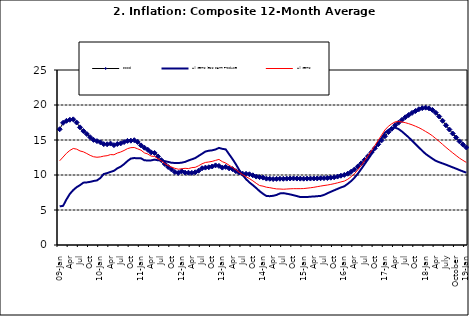
| Category | Food | All Items less Farm Produce | All Items |
|---|---|---|---|
| 09-Jan | 16.536 | 5.519 | 12.032 |
| Feb | 17.454 | 5.591 | 12.567 |
| Mar | 17.742 | 6.51 | 13.101 |
| Apr | 17.89 | 7.302 | 13.51 |
| May | 17.949 | 7.847 | 13.787 |
| June | 17.498 | 8.259 | 13.694 |
| Jul | 16.808 | 8.554 | 13.437 |
| Aug | 16.278 | 8.906 | 13.307 |
| Sep | 15.859 | 8.942 | 13.065 |
| Oct | 15.396 | 9.024 | 12.803 |
| Nov | 15.018 | 9.143 | 12.609 |
| Dec | 14.841 | 9.226 | 12.538 |
| 10-Jan | 14.668 | 9.567 | 12.586 |
| Feb | 14.411 | 10.138 | 12.7 |
| Mar | 14.395 | 10.269 | 12.757 |
| Apr | 14.489 | 10.444 | 12.915 |
| May | 14.266 | 10.597 | 12.893 |
| Jun | 14.424 | 10.948 | 13.132 |
| Jul | 14.514 | 11.193 | 13.284 |
| Aug | 14.706 | 11.549 | 13.5 |
| Sep | 14.872 | 11.997 | 13.764 |
| Oct | 14.906 | 12.345 | 13.908 |
| Nov | 14.967 | 12.423 | 13.928 |
| Dec | 14.723 | 12.383 | 13.74 |
| 11-Jan | 14.233 | 12.385 | 13.542 |
| Feb | 13.903 | 12.099 | 13.161 |
| Mar | 13.606 | 12.077 | 13.001 |
| Apr | 13.227 | 12.088 | 12.694 |
| May | 13.152 | 12.198 | 12.648 |
| Jun | 12.654 | 12.1 | 12.321 |
| Jul | 12.118 | 12.109 | 12.009 |
| Aug | 11.575 | 11.98 | 11.635 |
| Sep | 11.155 | 11.877 | 11.363 |
| Oct | 10.797 | 11.746 | 11.13 |
| Nov | 10.422 | 11.721 | 10.952 |
| Dec | 10.298 | 11.706 | 10.826 |
| 12-Jan | 10.538 | 11.765 | 10.886 |
| 12-Feb | 10.336 | 11.872 | 10.955 |
| 12-Mar | 10.325 | 12.075 | 10.914 |
| Apr | 10.304 | 12.242 | 11.054 |
| May | 10.387 | 12.419 | 11.096 |
| Jun | 10.617 | 12.732 | 11.32 |
| Jul | 10.963 | 13.032 | 11.599 |
| Aug | 11.056 | 13.349 | 11.791 |
| Sep | 11.104 | 13.467 | 11.859 |
| Oct | 11.216 | 13.525 | 11.948 |
| Nov | 11.372 | 13.649 | 12.091 |
| Dec | 11.296 | 13.873 | 12.224 |
| 13-Jan | 11.055 | 13.737 | 11.908 |
| Feb | 11.153 | 13.657 | 11.703 |
| Mar | 10.951 | 12.963 | 11.394 |
| Apr | 10.844 | 12.281 | 11.072 |
| May | 10.548 | 11.531 | 10.761 |
| Jun | 10.352 | 10.704 | 10.383 |
| Jul | 10.186 | 10.005 | 10.047 |
| Aug | 10.168 | 9.4 | 9.761 |
| Sep | 10.105 | 8.939 | 9.486 |
| Oct | 9.955 | 8.553 | 9.167 |
| Nov | 9.774 | 8.136 | 8.815 |
| Dec | 9.695 | 7.691 | 8.496 |
| 14-Jan | 9.626 | 7.317 | 8.408 |
| Feb | 9.484 | 7.005 | 8.257 |
| Mar | 9.464 | 6.976 | 8.19 |
| Apr | 9.416 | 7.03 | 8.092 |
| May | 9.448 | 7.151 | 8.012 |
| Jun | 9.464 | 7.369 | 7.998 |
| Jul | 9.459 | 7.411 | 7.968 |
| Aug | 9.481 | 7.325 | 7.996 |
| Sep | 9.501 | 7.228 | 8.027 |
| Oct | 9.508 | 7.116 | 8.047 |
| Nov | 9.492 | 6.991 | 8.046 |
| Dec | 9.481 | 6.854 | 8.047 |
| 15-Jan | 9.475 | 6.865 | 8.063 |
| Feb | 9.486 | 6.852 | 8.117 |
| Mar | 9.495 | 6.905 | 8.176 |
| Apr | 9.501 | 6.922 | 8.243 |
| May | 9.51 | 6.975 | 8.331 |
| Jun | 9.535 | 7.006 | 8.417 |
| Jul | 9.552 | 7.154 | 8.497 |
| Aug | 9.571 | 7.384 | 8.566 |
| Sep | 9.614 | 7.605 | 8.658 |
| Oct | 9.68 | 7.812 | 8.76 |
| Nov | 9.778 | 8.016 | 8.879 |
| Dec | 9.898 | 8.222 | 9.009 |
| 16-Jan | 10.017 | 8.391 | 9.13 |
| Feb | 10.184 | 8.732 | 9.386 |
| Mar | 10.471 | 9.132 | 9.751 |
| Apr | 10.786 | 9.614 | 10.182 |
| May | 11.221 | 10.196 | 10.746 |
| Jun | 11.672 | 10.864 | 11.372 |
| Jul | 12.162 | 11.553 | 12.045 |
| Aug | 12.696 | 12.247 | 12.744 |
| Sep | 13.238 | 12.98 | 13.454 |
| Oct | 13.817 | 13.757 | 14.206 |
| Nov | 14.386 | 14.542 | 14.958 |
| Dec | 14.946 | 15.307 | 15.697 |
| 17-Jan | 15.536 | 16.042 | 16.441 |
| Feb | 16.127 | 16.436 | 16.958 |
| Mar | 16.598 | 16.682 | 17.315 |
| Apr | 17.106 | 16.772 | 17.591 |
| May | 17.477 | 16.567 | 17.628 |
| Jun | 17.868 | 16.219 | 17.578 |
| Jul | 18.247 | 15.798 | 17.475 |
| Aug | 18.569 | 15.372 | 17.331 |
| Sep | 18.876 | 14.903 | 17.17 |
| Oct | 19.14 | 14.415 | 16.968 |
| Nov | 19.392 | 13.93 | 16.76 |
| Dec | 19.546 | 13.458 | 16.502 |
| 18-Jan | 19.621 | 13.01 | 16.215 |
| Feb | 19.521 | 12.668 | 15.93 |
| Mar | 19.294 | 12.33 | 15.599 |
| Apr | 18.886 | 12.021 | 15.196 |
| May | 18.359 | 11.828 | 14.793 |
| June | 17.745 | 11.651 | 14.371 |
| July | 17.102 | 11.478 | 13.95 |
| August | 16.501 | 11.285 | 13.546 |
| September | 15.923 | 11.092 | 13.157 |
| October | 15.355 | 10.903 | 12.777 |
| November | 14.802 | 10.703 | 12.406 |
| December | 14.348 | 10.514 | 12.095 |
| 19-Jan | 13.934 | 10.339 | 11.801 |